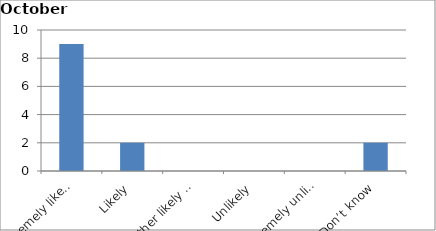
| Category | Series 0 |
|---|---|
| Extremely likely | 9 |
| Likely | 2 |
| Neither likely nor unlikely | 0 |
| Unlikely | 0 |
| Extremely unlikely | 0 |
| Don’t know | 2 |